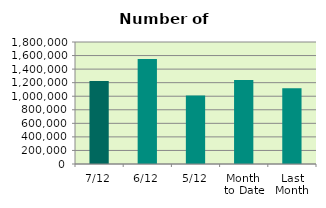
| Category | Series 0 |
|---|---|
| 7/12 | 1225490 |
| 6/12 | 1550892 |
| 5/12 | 1011092 |
| Month 
to Date | 1240210.4 |
| Last
Month | 1117514.364 |